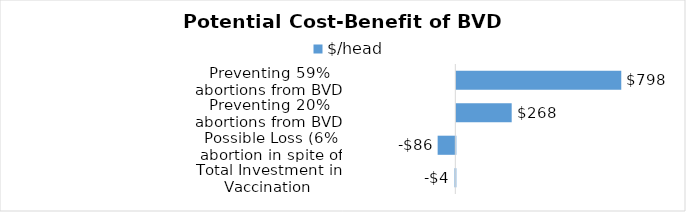
| Category | $/head |
|---|---|
| Total Investment in Vaccination | -4.03 |
| Possible Loss (6% abortion in spite of vaccination)     | -85.6 |
| Preventing 20% abortions from BVD could save: | 267.87 |
| Preventing 59% abortions from BVD could save: | 798.075 |